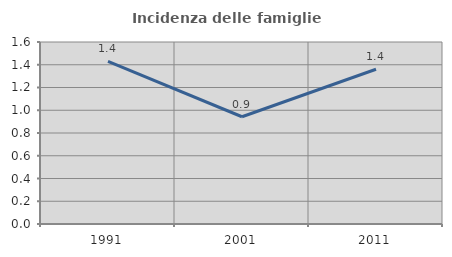
| Category | Incidenza delle famiglie numerose |
|---|---|
| 1991.0 | 1.429 |
| 2001.0 | 0.943 |
| 2011.0 | 1.361 |